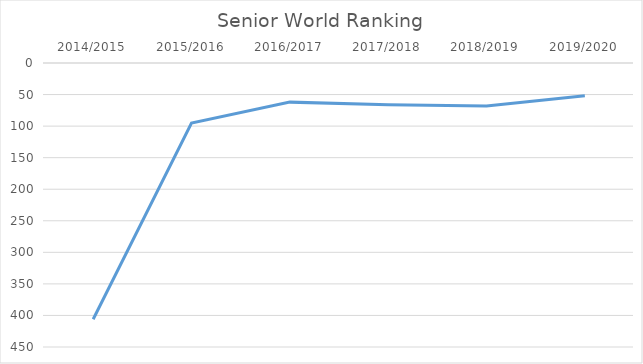
| Category | Series 0 |
|---|---|
| 2014/2015 | 406 |
| 2015/2016 | 95 |
| 2016/2017 | 62 |
| 2017/2018 | 66 |
| 2018/2019 | 68 |
| 2019/2020 | 52 |